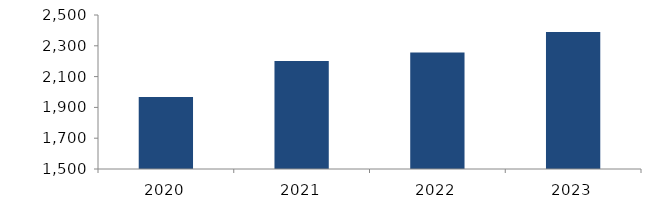
| Category | Bogotá |
|---|---|
| 2020.0 | 1968.203 |
| 2021.0 | 2201.089 |
| 2022.0 | 2256.27 |
| 2023.0 | 2389.524 |